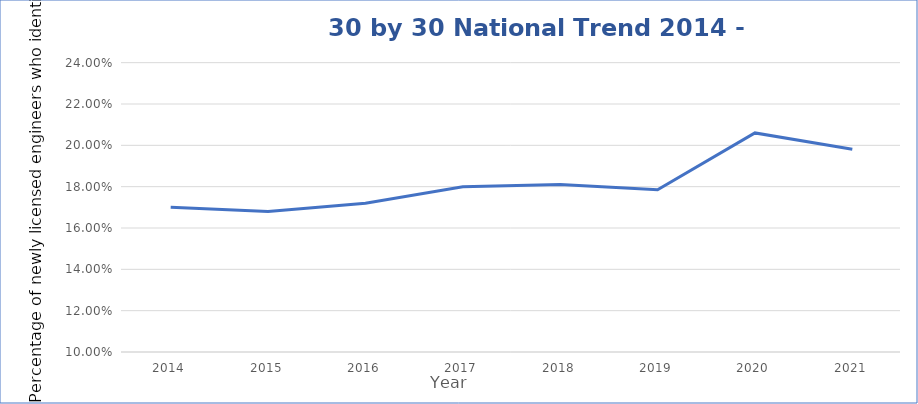
| Category |   National 30 by 30 Percentage   |
|---|---|
| 2014.0 | 0.17 |
| 2015.0 | 0.168 |
| 2016.0 | 0.172 |
| 2017.0 | 0.18 |
| 2018.0 | 0.181 |
| 2019.0 | 0.178 |
| 2020.0 | 0.206 |
| 2021.0 | 0.198 |